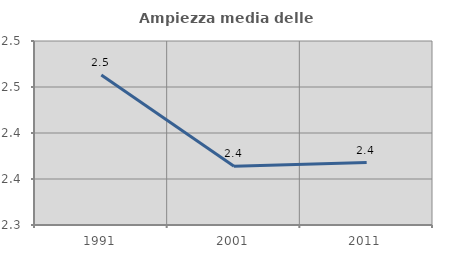
| Category | Ampiezza media delle famiglie |
|---|---|
| 1991.0 | 2.463 |
| 2001.0 | 2.364 |
| 2011.0 | 2.368 |